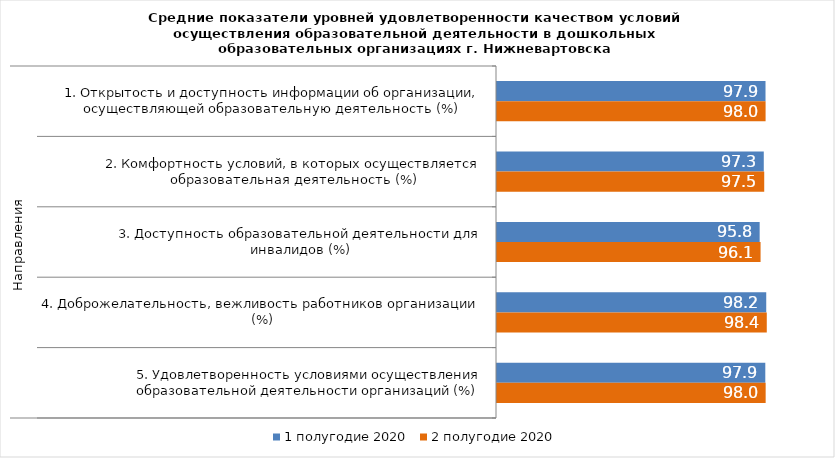
| Category | 1 полугодие 2020 | 2 полугодие 2020 |
|---|---|---|
| 0 | 97.937 | 97.966 |
| 1 | 97.306 | 97.468 |
| 2 | 95.806 | 96.136 |
| 3 | 98.201 | 98.399 |
| 4 | 97.86 | 97.99 |